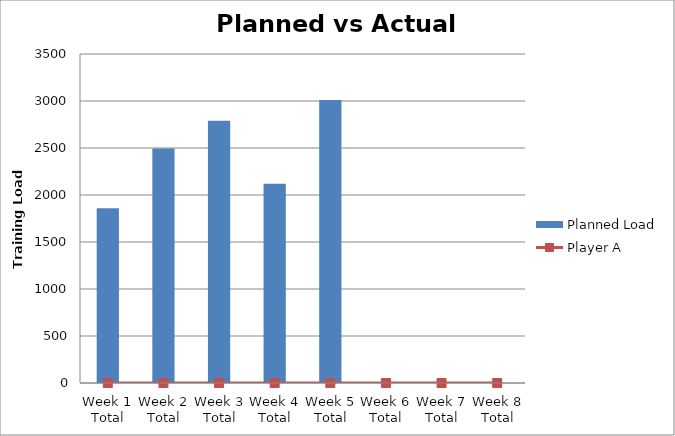
| Category | Planned Load |
|---|---|
| Week 1 Total | 1860 |
| Week 2 Total | 2495 |
| Week 3 Total | 2790 |
| Week 4 Total | 2120 |
| Week 5 Total | 3010 |
| Week 6 Total | 0 |
| Week 7 Total | 0 |
| Week 8 Total | 0 |